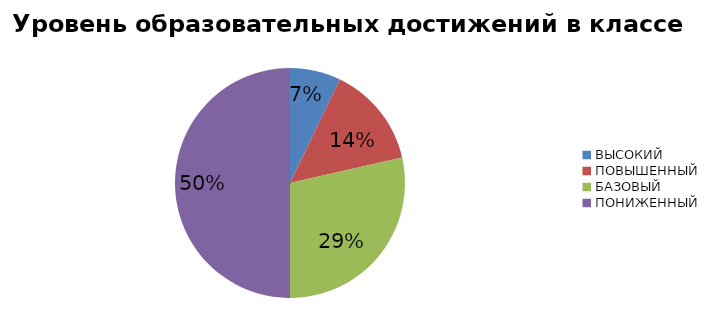
| Category | Series 0 |
|---|---|
| ВЫСОКИЙ | 3.03 |
| ПОВЫШЕННЫЙ | 6.061 |
| БАЗОВЫЙ | 12.121 |
| ПОНИЖЕННЫЙ | 21.212 |